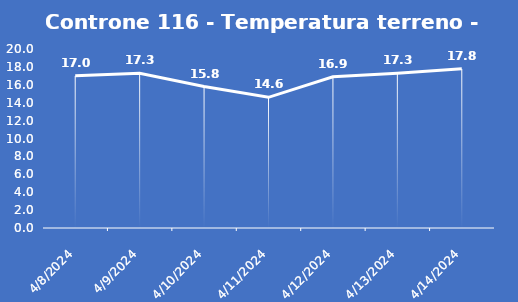
| Category | Controne 116 - Temperatura terreno - Grezzo (°C) |
|---|---|
| 4/8/24 | 17 |
| 4/9/24 | 17.3 |
| 4/10/24 | 15.8 |
| 4/11/24 | 14.6 |
| 4/12/24 | 16.9 |
| 4/13/24 | 17.3 |
| 4/14/24 | 17.8 |